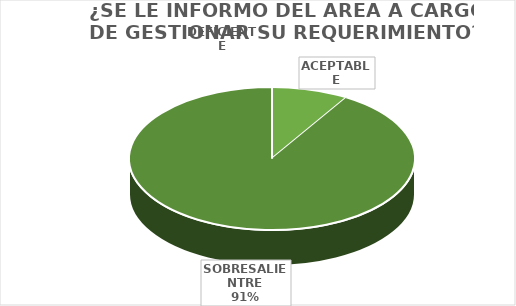
| Category | Series 0 |
|---|---|
| DEFICIENTE | 0 |
| ACEPTABLE | 4 |
| SOBRESALIENTRE | 42 |